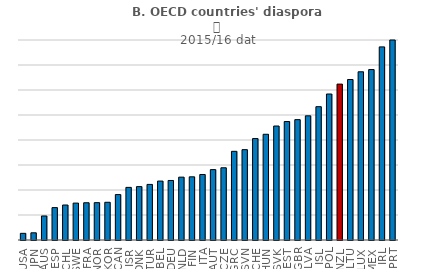
| Category | 2015/16 |
|---|---|
| USA | 0.534 |
| JPN | 0.576 |
| AUS | 1.922 |
| ESP | 2.59 |
| CHL | 2.8 |
| SWE | 2.951 |
| FRA | 2.98 |
| NOR | 2.987 |
| KOR | 3.018 |
| CAN | 3.634 |
| ISR | 4.21 |
| DNK | 4.27 |
| TUR | 4.447 |
| BEL | 4.714 |
| DEU | 4.762 |
| NLD | 5.028 |
| FIN | 5.054 |
| ITA | 5.241 |
| AUT | 5.631 |
| CZE | 5.778 |
| GRC | 7.095 |
| SVN | 7.227 |
| CHE | 8.116 |
| HUN | 8.458 |
| SVK | 9.119 |
| EST | 9.477 |
| GBR | 9.629 |
| LVA | 9.934 |
| ISL | 10.666 |
| POL | 11.679 |
| NZL | 12.472 |
| LTU | 12.84 |
| LUX | 13.457 |
| MEX | 13.634 |
| IRL | 15.449 |
| PRT | 16.208 |